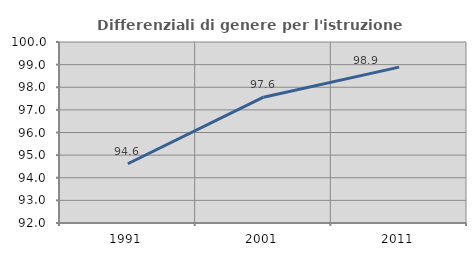
| Category | Differenziali di genere per l'istruzione superiore |
|---|---|
| 1991.0 | 94.618 |
| 2001.0 | 97.561 |
| 2011.0 | 98.889 |